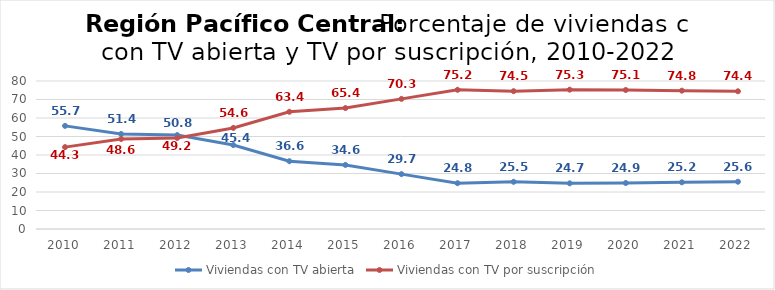
| Category | Viviendas con TV abierta | Viviendas con TV por suscripción |
|---|---|---|
| 2010.0 | 55.741 | 44.259 |
| 2011.0 | 51.354 | 48.646 |
| 2012.0 | 50.78 | 49.22 |
| 2013.0 | 45.364 | 54.636 |
| 2014.0 | 36.64 | 63.36 |
| 2015.0 | 34.63 | 65.37 |
| 2016.0 | 29.655 | 70.345 |
| 2017.0 | 24.761 | 75.239 |
| 2018.0 | 25.505 | 74.495 |
| 2019.0 | 24.684 | 75.316 |
| 2020.0 | 24.861 | 75.139 |
| 2021.0 | 25.229 | 74.771 |
| 2022.0 | 25.561 | 74.439 |